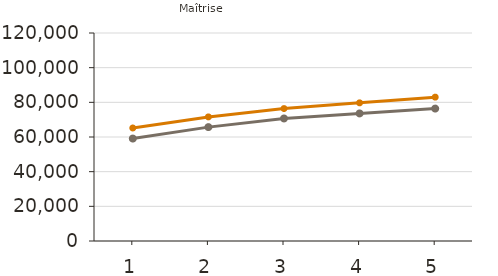
| Category | Moyens | Médians |
|---|---|---|
| 1.0 | 65200 | 59100 |
| 2.0 | 71600 | 65700 |
| 3.0 | 76400 | 70700 |
| 4.0 | 79700 | 73600 |
| 5.0 | 83000 | 76400 |